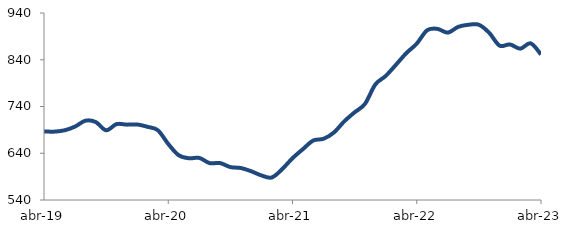
| Category | Series 0 |
|---|---|
| 2019-04-01 | 686.669 |
| 2019-05-01 | 686.255 |
| 2019-06-01 | 689.181 |
| 2019-07-01 | 697.076 |
| 2019-08-01 | 709.635 |
| 2019-09-01 | 706.734 |
| 2019-10-01 | 689.137 |
| 2019-11-01 | 702.277 |
| 2019-12-01 | 701.214 |
| 2020-01-01 | 701.517 |
| 2020-02-01 | 696.552 |
| 2020-03-01 | 689.099 |
| 2020-04-01 | 659.896 |
| 2020-05-01 | 635.894 |
| 2020-06-01 | 629.29 |
| 2020-07-01 | 629.994 |
| 2020-08-01 | 618.866 |
| 2020-09-01 | 619.022 |
| 2020-10-01 | 610.428 |
| 2020-11-01 | 608.402 |
| 2020-12-01 | 601.605 |
| 2021-01-01 | 592.504 |
| 2021-02-01 | 588.185 |
| 2021-03-01 | 605.989 |
| 2021-04-01 | 629.446 |
| 2021-05-01 | 648.73 |
| 2021-06-01 | 667.177 |
| 2021-07-01 | 670.996 |
| 2021-08-01 | 684.389 |
| 2021-09-01 | 708.308 |
| 2021-10-01 | 727.608 |
| 2021-11-01 | 745.65 |
| 2021-12-01 | 787.184 |
| 2022-01-01 | 805.308 |
| 2022-02-01 | 829.502 |
| 2022-03-01 | 854.336 |
| 2022-04-01 | 874.453 |
| 2022-05-01 | 903.049 |
| 2022-06-01 | 906.022 |
| 2022-07-01 | 898.071 |
| 2022-08-01 | 910.353 |
| 2022-09-01 | 914.859 |
| 2022-10-01 | 914.857 |
| 2022-11-01 | 897.607 |
| 2022-12-01 | 870.196 |
| 2023-01-01 | 872.784 |
| 2023-02-01 | 863.736 |
| 2023-03-01 | 875.118 |
| 2023-04-01 | 851.276 |